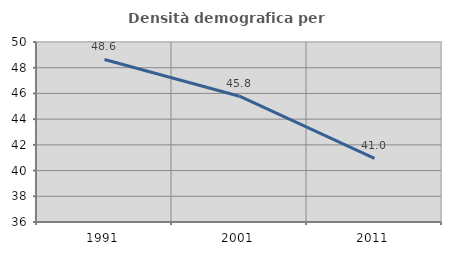
| Category | Densità demografica |
|---|---|
| 1991.0 | 48.642 |
| 2001.0 | 45.785 |
| 2011.0 | 40.953 |